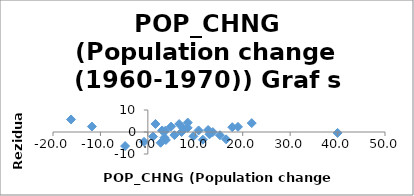
| Category | Series 0 |
|---|---|
| 13.7 | -0.043 |
| -0.8 | -4.463 |
| 9.6 | -1.976 |
| 40.0 | -0.43 |
| 8.41 | 4.28 |
| 3.5 | -2.563 |
| 3.0 | 0.698 |
| 7.1 | -0.018 |
| 13.0 | -1.041 |
| 10.7 | 0.704 |
| -16.2 | 5.697 |
| 6.6 | 3.612 |
| 21.9 | 4.051 |
| 17.8 | 2.202 |
| -11.8 | 2.49 |
| 7.5 | 1.611 |
| 3.7 | 0.608 |
| 1.6 | 3.654 |
| 8.4 | 1.87 |
| 2.7 | -4.885 |
| 5.6 | -1.406 |
| 12.7 | 0.927 |
| -4.8 | -6.394 |
| 16.5 | -3.336 |
| 15.2 | -1.458 |
| 11.6 | -3.493 |
| 4.9 | 2.445 |
| 1.1 | -2.068 |
| 3.8 | -3.622 |
| 19.0 | 2.347 |